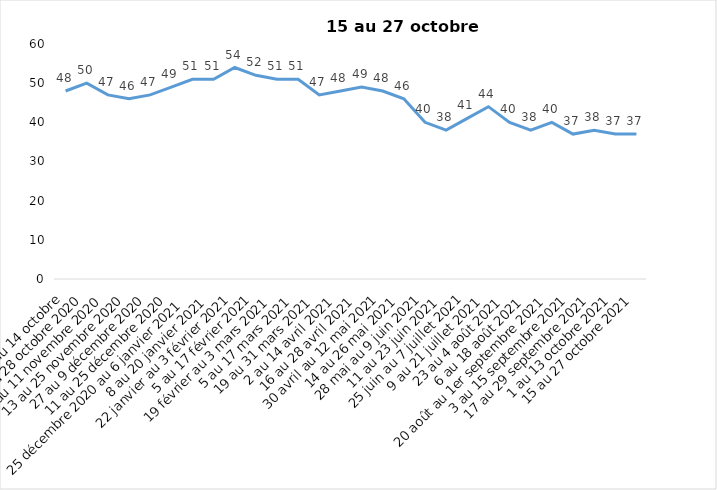
| Category | Toujours aux trois mesures |
|---|---|
| 2 au 14 octobre | 48 |
| 16 au 28 octobre 2020 | 50 |
| 30 octobre au 11 novembre 2020 | 47 |
| 13 au 25 novembre 2020 | 46 |
| 27 au 9 décembre 2020 | 47 |
| 11 au 25 décembre 2020 | 49 |
| 25 décembre 2020 au 6 janvier 2021 | 51 |
| 8 au 20 janvier 2021 | 51 |
| 22 janvier au 3 février 2021 | 54 |
| 5 au 17 février 2021 | 52 |
| 19 février au 3 mars 2021 | 51 |
| 5 au 17 mars 2021 | 51 |
| 19 au 31 mars 2021 | 47 |
| 2 au 14 avril 2021 | 48 |
| 16 au 28 avril 2021 | 49 |
| 30 avril au 12 mai 2021 | 48 |
| 14 au 26 mai 2021 | 46 |
| 28 mai au 9 juin 2021 | 40 |
| 11 au 23 juin 2021 | 38 |
| 25 juin au 7 juillet 2021 | 41 |
| 9 au 21 juillet 2021 | 44 |
| 23 au 4 août 2021 | 40 |
| 6 au 18 août 2021 | 38 |
| 20 août au 1er septembre 2021 | 40 |
| 3 au 15 septembre 2021 | 37 |
| 17 au 29 septembre 2021 | 38 |
| 1 au 13 octobre 2021 | 37 |
| 15 au 27 octobre 2021 | 37 |